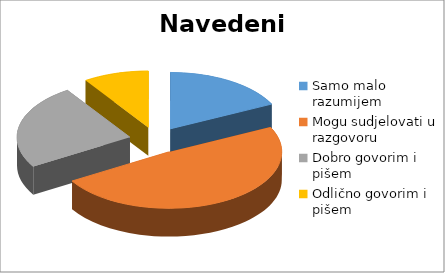
| Category | POSTOTAK |
|---|---|
| Samo malo razumijem | 0.19 |
| Mogu sudjelovati u razgovoru | 0.52 |
| Dobro govorim i pišem  | 0.26 |
| Odlično govorim i pišem | 0.1 |